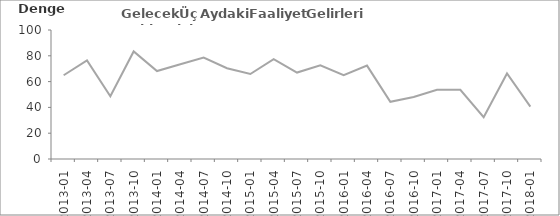
| Category | Gelecek Üç Aydaki Faaliyet Gelirleri Beklentisi |
|---|---|
| 2013-01 | 64.9 |
| 2013-04 | 76.4 |
| 2013-07 | 48.6 |
| 2013-10 | 83.4 |
| 2014-01 | 68.2 |
| 2014-04 | 73.4 |
| 2014-07 | 78.6 |
| 2014-10 | 70.4 |
| 2015-01 | 65.9 |
| 2015-04 | 77.4 |
| 2015-07 | 67 |
| 2015-10 | 72.7 |
| 2016-01 | 65 |
| 2016-04 | 72.4 |
| 2016-07 | 44.3 |
| 2016-10 | 48.1 |
| 2017-01 | 53.6 |
| 2017-04 | 53.6 |
| 2017-07 | 32.4 |
| 2017-10 | 66.3 |
| 2018-01 | 40.6 |